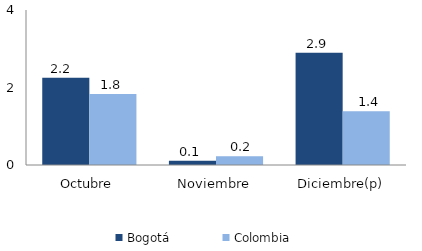
| Category | Bogotá | Colombia |
|---|---|---|
| Octubre | 2.25 | 1.834 |
| Noviembre | 0.11 | 0.224 |
| Diciembre(p) | 2.894 | 1.385 |